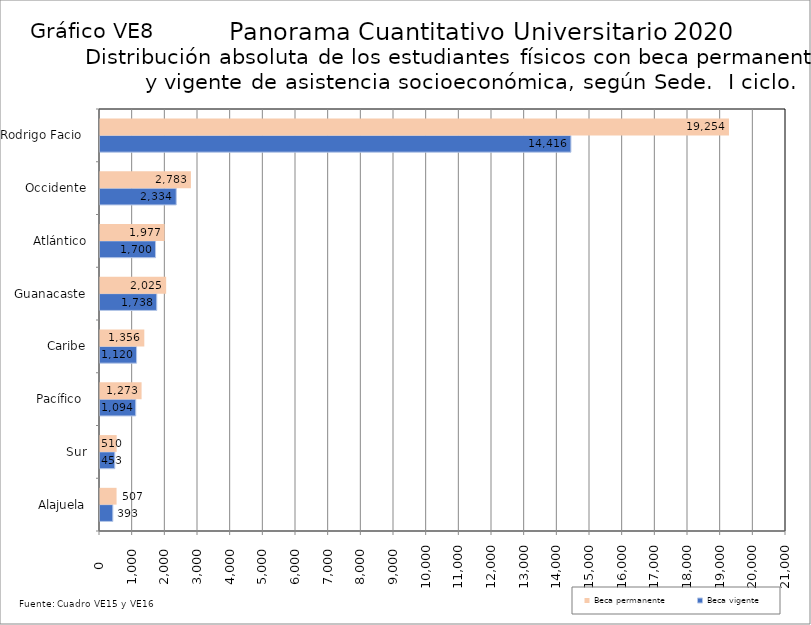
| Category | Beca vigente | Beca permanente |
|---|---|---|
| Alajuela | 393 | 507 |
| Sur | 453 | 510 |
| Pacífico  | 1094 | 1273 |
| Caribe | 1120 | 1356 |
| Guanacaste | 1738 | 2025 |
| Atlántico | 1700 | 1977 |
| Occidente | 2334 | 2783 |
| Rodrigo Facio  | 14416 | 19254 |